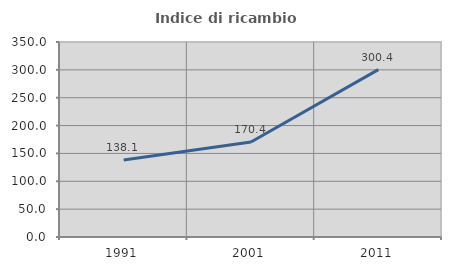
| Category | Indice di ricambio occupazionale  |
|---|---|
| 1991.0 | 138.111 |
| 2001.0 | 170.447 |
| 2011.0 | 300.422 |